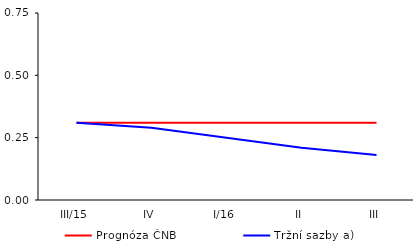
| Category | Prognóza ČNB | Tržní sazby a) |
|---|---|---|
| III/15 | 0.31 | 0.31 |
| IV | 0.31 | 0.29 |
| I/16 | 0.31 | 0.25 |
| II | 0.31 | 0.21 |
| III | 0.31 | 0.18 |